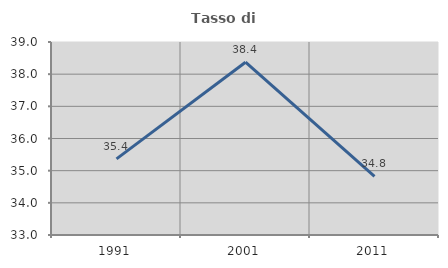
| Category | Tasso di occupazione   |
|---|---|
| 1991.0 | 35.366 |
| 2001.0 | 38.372 |
| 2011.0 | 34.824 |